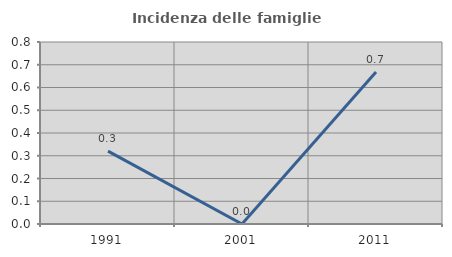
| Category | Incidenza delle famiglie numerose |
|---|---|
| 1991.0 | 0.321 |
| 2001.0 | 0 |
| 2011.0 | 0.668 |